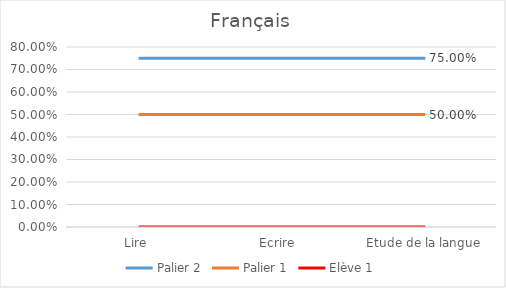
| Category | Palier 2 | Palier 1 | Elève 1 |
|---|---|---|---|
| Lire | 0.75 | 0.5 | 0 |
| Ecrire  | 0.75 | 0.5 | 0 |
| Etude de la langue | 0.75 | 0.5 | 0 |